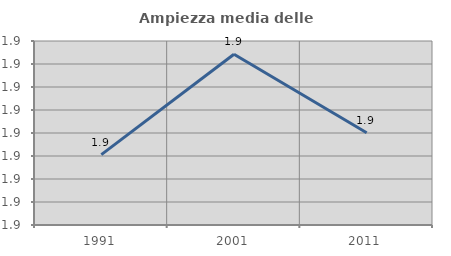
| Category | Ampiezza media delle famiglie |
|---|---|
| 1991.0 | 1.881 |
| 2001.0 | 1.924 |
| 2011.0 | 1.89 |